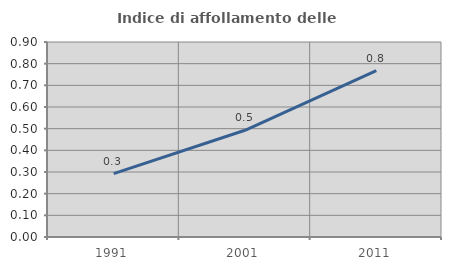
| Category | Indice di affollamento delle abitazioni  |
|---|---|
| 1991.0 | 0.292 |
| 2001.0 | 0.493 |
| 2011.0 | 0.768 |